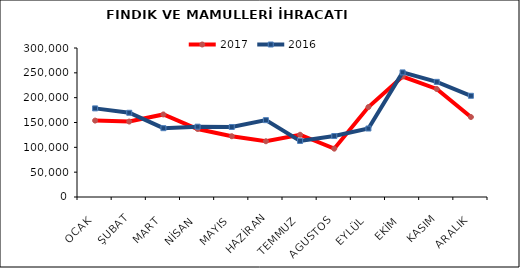
| Category | 2017 | 2016 |
|---|---|---|
| OCAK | 153847.917 | 178413.554 |
| ŞUBAT | 151901.18 | 169593.449 |
| MART | 166205.429 | 138571.215 |
| NİSAN | 136966.568 | 141600.099 |
| MAYIS | 122369.906 | 140964.309 |
| HAZİRAN | 112243.673 | 154724.564 |
| TEMMUZ | 125317.916 | 112831.105 |
| AGUSTOS | 97330.064 | 122766.211 |
| EYLÜL | 181140.742 | 137872.996 |
| EKİM | 242483.735 | 250831.774 |
| KASIM | 217487.856 | 231827 |
| ARALIK | 161013.72 | 203792.226 |